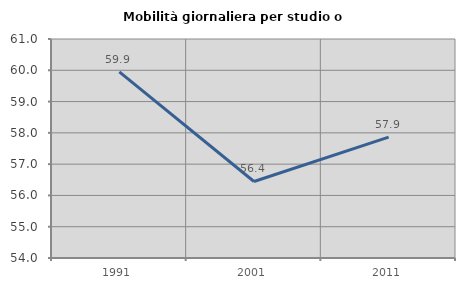
| Category | Mobilità giornaliera per studio o lavoro |
|---|---|
| 1991.0 | 59.947 |
| 2001.0 | 56.446 |
| 2011.0 | 57.863 |